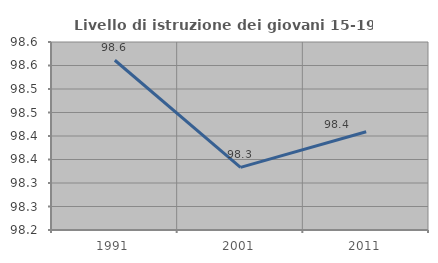
| Category | Livello di istruzione dei giovani 15-19 anni |
|---|---|
| 1991.0 | 98.561 |
| 2001.0 | 98.333 |
| 2011.0 | 98.409 |